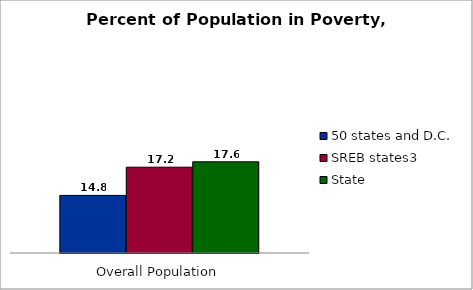
| Category | 50 states and D.C. | SREB states3 | State |
|---|---|---|---|
| 0 | 14.8 | 17.15 | 17.6 |